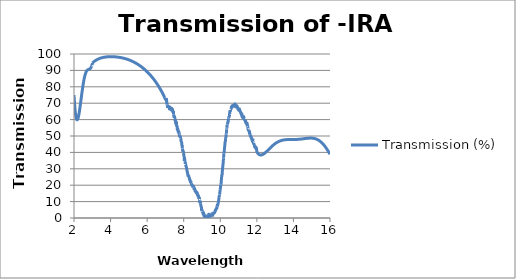
| Category | Transmission (%) |
|---|---|
| 2.00007 | 74.943 |
| 2.00994 | 73.118 |
| 2.0201 | 71.375 |
| 2.02997 | 69.81 |
| 2.03984 | 68.37 |
| 2.04998 | 67.018 |
| 2.05984 | 65.826 |
| 2.06999 | 64.724 |
| 2.07984 | 63.77 |
| 2.08997 | 62.906 |
| 2.09982 | 62.178 |
| 2.10995 | 61.54 |
| 2.11979 | 61.025 |
| 2.12991 | 60.598 |
| 2.14003 | 60.273 |
| 2.14986 | 60.051 |
| 2.15997 | 59.914 |
| 2.1698 | 59.867 |
| 2.1799 | 59.903 |
| 2.19 | 60.019 |
| 2.19982 | 60.206 |
| 2.20991 | 60.469 |
| 2.21972 | 60.79 |
| 2.22981 | 61.183 |
| 2.23989 | 61.635 |
| 2.24969 | 62.127 |
| 2.25977 | 62.684 |
| 2.26984 | 63.287 |
| 2.27991 | 63.932 |
| 2.2897 | 64.596 |
| 2.29976 | 65.313 |
| 2.30982 | 66.06 |
| 2.31987 | 66.833 |
| 2.32964 | 67.606 |
| 2.33969 | 68.42 |
| 2.34973 | 69.249 |
| 2.35977 | 70.089 |
| 2.36981 | 70.938 |
| 2.37984 | 71.791 |
| 2.38959 | 72.623 |
| 2.39962 | 73.477 |
| 2.40964 | 74.328 |
| 2.41965 | 75.171 |
| 2.42967 | 76.005 |
| 2.43968 | 76.827 |
| 2.44968 | 77.636 |
| 2.45968 | 78.428 |
| 2.46968 | 79.201 |
| 2.47968 | 79.955 |
| 2.48967 | 80.687 |
| 2.49965 | 81.396 |
| 2.50964 | 82.081 |
| 2.51961 | 82.739 |
| 2.52959 | 83.371 |
| 2.53956 | 83.976 |
| 2.54953 | 84.552 |
| 2.55949 | 85.099 |
| 2.56972 | 85.631 |
| 2.57968 | 86.119 |
| 2.58963 | 86.577 |
| 2.59957 | 87.005 |
| 2.60952 | 87.404 |
| 2.61945 | 87.775 |
| 2.62966 | 88.126 |
| 2.63959 | 88.439 |
| 2.64952 | 88.725 |
| 2.65944 | 88.985 |
| 2.66963 | 89.226 |
| 2.67954 | 89.436 |
| 2.68945 | 89.624 |
| 2.69963 | 89.794 |
| 2.70953 | 89.939 |
| 2.71943 | 90.066 |
| 2.72959 | 90.179 |
| 2.73948 | 90.274 |
| 2.74936 | 90.355 |
| 2.75951 | 90.426 |
| 2.76939 | 90.486 |
| 2.77953 | 90.539 |
| 2.78939 | 90.585 |
| 2.79953 | 90.628 |
| 2.80938 | 90.669 |
| 2.81951 | 90.711 |
| 2.82935 | 90.754 |
| 2.83947 | 90.802 |
| 2.84931 | 90.856 |
| 2.85941 | 90.92 |
| 2.86952 | 90.995 |
| 2.87934 | 91.079 |
| 2.88943 | 91.181 |
| 2.89925 | 91.295 |
| 2.90933 | 91.43 |
| 2.91941 | 91.585 |
| 2.92921 | 91.756 |
| 2.93927 | 91.954 |
| 2.94934 | 92.175 |
| 2.9594 | 92.421 |
| 2.96918 | 92.684 |
| 2.97923 | 92.98 |
| 2.98927 | 93.303 |
| 2.99931 | 93.228 |
| 3.00934 | 94.547 |
| 3.01937 | 94.653 |
| 3.02939 | 94.756 |
| 3.03914 | 94.853 |
| 3.04915 | 94.952 |
| 3.05916 | 95.048 |
| 3.06916 | 95.142 |
| 3.07916 | 95.234 |
| 3.08916 | 95.324 |
| 3.09914 | 95.412 |
| 3.10913 | 95.497 |
| 3.1191 | 95.581 |
| 3.12908 | 95.663 |
| 3.13931 | 95.745 |
| 3.14927 | 95.823 |
| 3.15923 | 95.899 |
| 3.16918 | 95.974 |
| 3.17913 | 96.046 |
| 3.18907 | 96.117 |
| 3.19927 | 96.188 |
| 3.2092 | 96.256 |
| 3.21912 | 96.322 |
| 3.22904 | 96.386 |
| 3.23922 | 96.451 |
| 3.24913 | 96.512 |
| 3.25904 | 96.572 |
| 3.2692 | 96.632 |
| 3.27909 | 96.689 |
| 3.28898 | 96.744 |
| 3.29913 | 96.8 |
| 3.309 | 96.852 |
| 3.31914 | 96.905 |
| 3.329 | 96.955 |
| 3.33912 | 97.005 |
| 3.34898 | 97.053 |
| 3.35909 | 97.1 |
| 3.36893 | 97.145 |
| 3.37903 | 97.19 |
| 3.38913 | 97.234 |
| 3.39895 | 97.276 |
| 3.40903 | 97.317 |
| 3.41911 | 97.358 |
| 3.42892 | 97.396 |
| 3.43898 | 97.434 |
| 3.44904 | 97.472 |
| 3.45883 | 97.507 |
| 3.46888 | 97.542 |
| 3.47892 | 97.576 |
| 3.48896 | 97.61 |
| 3.49899 | 97.642 |
| 3.50901 | 97.673 |
| 3.51903 | 97.703 |
| 3.52904 | 97.733 |
| 3.53878 | 97.761 |
| 3.54878 | 97.789 |
| 3.55877 | 97.815 |
| 3.56876 | 97.842 |
| 3.579 | 97.867 |
| 3.58897 | 97.892 |
| 3.59894 | 97.916 |
| 3.6089 | 97.938 |
| 3.61885 | 97.961 |
| 3.6288 | 97.982 |
| 3.63874 | 98.003 |
| 3.64894 | 98.023 |
| 3.65887 | 98.042 |
| 3.66879 | 98.061 |
| 3.6787 | 98.079 |
| 3.68887 | 98.096 |
| 3.69878 | 98.113 |
| 3.70867 | 98.129 |
| 3.71882 | 98.145 |
| 3.7287 | 98.159 |
| 3.73884 | 98.174 |
| 3.74871 | 98.187 |
| 3.75883 | 98.201 |
| 3.76869 | 98.213 |
| 3.7788 | 98.225 |
| 3.78864 | 98.236 |
| 3.79873 | 98.247 |
| 3.80882 | 98.257 |
| 3.81864 | 98.267 |
| 3.82872 | 98.276 |
| 3.83878 | 98.285 |
| 3.84859 | 98.293 |
| 3.85864 | 98.301 |
| 3.86868 | 98.308 |
| 3.87872 | 98.315 |
| 3.88875 | 98.321 |
| 3.89852 | 98.327 |
| 3.90854 | 98.332 |
| 3.91854 | 98.337 |
| 3.92855 | 98.341 |
| 3.93854 | 98.345 |
| 3.94853 | 98.348 |
| 3.95851 | 98.351 |
| 3.96848 | 98.354 |
| 3.9787 | 98.356 |
| 3.98866 | 98.358 |
| 3.99861 | 98.359 |
| 4.00856 | 98.36 |
| 4.01849 | 98.36 |
| 4.02867 | 98.36 |
| 4.0386 | 98.36 |
| 4.04851 | 98.359 |
| 4.05841 | 98.358 |
| 4.06857 | 98.356 |
| 4.07846 | 98.354 |
| 4.08859 | 98.351 |
| 4.09847 | 98.349 |
| 4.10859 | 98.345 |
| 4.11845 | 98.342 |
| 4.12855 | 98.338 |
| 4.1384 | 98.333 |
| 4.14849 | 98.328 |
| 4.15857 | 98.323 |
| 4.16839 | 98.318 |
| 4.17845 | 98.312 |
| 4.18851 | 98.305 |
| 4.19831 | 98.299 |
| 4.20835 | 98.291 |
| 4.21838 | 98.284 |
| 4.2284 | 98.276 |
| 4.23842 | 98.268 |
| 4.24842 | 98.259 |
| 4.25842 | 98.25 |
| 4.26841 | 98.241 |
| 4.2784 | 98.231 |
| 4.28837 | 98.221 |
| 4.29834 | 98.21 |
| 4.30829 | 98.199 |
| 4.31824 | 98.188 |
| 4.32843 | 98.176 |
| 4.33836 | 98.164 |
| 4.34829 | 98.152 |
| 4.3582 | 98.139 |
| 4.36836 | 98.126 |
| 4.37825 | 98.112 |
| 4.38839 | 98.098 |
| 4.39827 | 98.084 |
| 4.40839 | 98.069 |
| 4.41825 | 98.054 |
| 4.42835 | 98.038 |
| 4.4382 | 98.022 |
| 4.44828 | 98.006 |
| 4.45835 | 97.989 |
| 4.46817 | 97.972 |
| 4.47823 | 97.955 |
| 4.48828 | 97.937 |
| 4.49831 | 97.918 |
| 4.5081 | 97.9 |
| 4.51812 | 97.881 |
| 4.52813 | 97.861 |
| 4.53813 | 97.841 |
| 4.54812 | 97.821 |
| 4.5581 | 97.8 |
| 4.56807 | 97.779 |
| 4.57828 | 97.757 |
| 4.58823 | 97.735 |
| 4.59818 | 97.713 |
| 4.60811 | 97.69 |
| 4.61804 | 97.667 |
| 4.62819 | 97.643 |
| 4.6381 | 97.619 |
| 4.648 | 97.595 |
| 4.65812 | 97.57 |
| 4.668 | 97.544 |
| 4.67811 | 97.518 |
| 4.68797 | 97.492 |
| 4.69806 | 97.465 |
| 4.70813 | 97.438 |
| 4.71796 | 97.411 |
| 4.72802 | 97.382 |
| 4.73807 | 97.354 |
| 4.74811 | 97.325 |
| 4.75813 | 97.295 |
| 4.76791 | 97.266 |
| 4.77792 | 97.235 |
| 4.78792 | 97.205 |
| 4.79791 | 97.173 |
| 4.80788 | 97.142 |
| 4.81809 | 97.109 |
| 4.82804 | 97.076 |
| 4.83799 | 97.043 |
| 4.84792 | 97.009 |
| 4.85785 | 96.975 |
| 4.868 | 96.94 |
| 4.8779 | 96.905 |
| 4.88803 | 96.869 |
| 4.89791 | 96.833 |
| 4.90802 | 96.796 |
| 4.91788 | 96.76 |
| 4.92796 | 96.722 |
| 4.9378 | 96.684 |
| 4.94786 | 96.645 |
| 4.95792 | 96.606 |
| 4.96796 | 96.566 |
| 4.97799 | 96.525 |
| 4.98777 | 96.485 |
| 4.99778 | 96.444 |
| 5.00778 | 96.402 |
| 5.0176 | 96.361 |
| 5.02817 | 96.315 |
| 5.03799 | 96.273 |
| 5.0478 | 96.229 |
| 5.05762 | 96.186 |
| 5.06819 | 96.138 |
| 5.078 | 96.093 |
| 5.08781 | 96.048 |
| 5.09762 | 96.002 |
| 5.10743 | 95.956 |
| 5.11799 | 95.905 |
| 5.1278 | 95.858 |
| 5.13761 | 95.81 |
| 5.14741 | 95.761 |
| 5.15797 | 95.708 |
| 5.16777 | 95.659 |
| 5.17758 | 95.608 |
| 5.18738 | 95.558 |
| 5.19793 | 95.502 |
| 5.20773 | 95.45 |
| 5.21753 | 95.398 |
| 5.22732 | 95.345 |
| 5.23787 | 95.287 |
| 5.24767 | 95.233 |
| 5.25746 | 95.178 |
| 5.26801 | 95.118 |
| 5.2778 | 95.062 |
| 5.28759 | 95.006 |
| 5.29737 | 94.949 |
| 5.30792 | 94.887 |
| 5.3177 | 94.828 |
| 5.32749 | 94.769 |
| 5.33727 | 94.71 |
| 5.34781 | 94.645 |
| 5.35759 | 94.584 |
| 5.36737 | 94.523 |
| 5.3779 | 94.456 |
| 5.38768 | 94.394 |
| 5.39746 | 94.331 |
| 5.40724 | 94.267 |
| 5.41776 | 94.198 |
| 5.42754 | 94.133 |
| 5.43731 | 94.067 |
| 5.44783 | 93.996 |
| 5.4576 | 93.929 |
| 5.46737 | 93.861 |
| 5.47714 | 93.793 |
| 5.48766 | 93.719 |
| 5.49743 | 93.65 |
| 5.50719 | 93.579 |
| 5.51771 | 93.503 |
| 5.52747 | 93.432 |
| 5.53723 | 93.36 |
| 5.54774 | 93.282 |
| 5.5575 | 93.208 |
| 5.56726 | 93.134 |
| 5.57777 | 93.054 |
| 5.58752 | 92.979 |
| 5.59728 | 92.903 |
| 5.60778 | 92.82 |
| 5.61753 | 92.743 |
| 5.62728 | 92.665 |
| 5.63703 | 92.586 |
| 5.64753 | 92.501 |
| 5.65728 | 92.421 |
| 5.66702 | 92.34 |
| 5.67752 | 92.253 |
| 5.68726 | 92.171 |
| 5.69701 | 92.088 |
| 5.7075 | 91.998 |
| 5.71724 | 91.914 |
| 5.72698 | 91.829 |
| 5.73746 | 91.737 |
| 5.7472 | 91.65 |
| 5.75768 | 91.557 |
| 5.76742 | 91.469 |
| 5.77715 | 91.381 |
| 5.78763 | 91.285 |
| 5.79736 | 91.195 |
| 5.80709 | 91.104 |
| 5.81757 | 91.006 |
| 5.82729 | 90.914 |
| 5.83702 | 90.821 |
| 5.84749 | 90.72 |
| 5.85721 | 90.626 |
| 5.86693 | 90.531 |
| 5.8774 | 90.427 |
| 5.88712 | 90.331 |
| 5.89759 | 90.226 |
| 5.9073 | 90.128 |
| 5.91702 | 90.029 |
| 5.92748 | 89.922 |
| 5.93719 | 89.821 |
| 5.94691 | 89.72 |
| 5.95736 | 89.61 |
| 5.96707 | 89.507 |
| 5.97753 | 89.395 |
| 5.98723 | 89.291 |
| 5.99694 | 89.186 |
| 6.00739 | 89.072 |
| 6.01709 | 88.965 |
| 6.02679 | 88.857 |
| 6.03724 | 88.74 |
| 6.04694 | 88.631 |
| 6.05738 | 88.512 |
| 6.06708 | 88.401 |
| 6.07678 | 88.289 |
| 6.08722 | 88.168 |
| 6.09691 | 88.054 |
| 6.10734 | 87.931 |
| 6.11703 | 87.815 |
| 6.12672 | 87.699 |
| 6.13716 | 87.573 |
| 6.14684 | 87.455 |
| 6.15727 | 87.327 |
| 6.16696 | 87.207 |
| 6.17738 | 87.077 |
| 6.18706 | 86.955 |
| 6.19674 | 86.832 |
| 6.20717 | 86.699 |
| 6.21684 | 86.574 |
| 6.22726 | 86.439 |
| 6.23694 | 86.313 |
| 6.24661 | 86.185 |
| 6.25703 | 86.047 |
| 6.2667 | 85.918 |
| 6.27711 | 85.777 |
| 6.28678 | 85.646 |
| 6.29719 | 85.503 |
| 6.30685 | 85.37 |
| 6.31726 | 85.225 |
| 6.32692 | 85.089 |
| 6.33658 | 84.953 |
| 6.34698 | 84.805 |
| 6.35664 | 84.666 |
| 6.36704 | 84.515 |
| 6.3767 | 84.375 |
| 6.38709 | 84.222 |
| 6.39675 | 84.079 |
| 6.40714 | 83.923 |
| 6.41679 | 83.778 |
| 6.42718 | 83.62 |
| 6.43683 | 83.472 |
| 6.44647 | 83.324 |
| 6.45686 | 83.162 |
| 6.4665 | 83.011 |
| 6.47689 | 82.847 |
| 6.48653 | 82.693 |
| 6.49691 | 82.526 |
| 6.50655 | 82.37 |
| 6.51692 | 82.201 |
| 6.52656 | 82.042 |
| 6.53693 | 81.87 |
| 6.54657 | 81.709 |
| 6.55694 | 81.533 |
| 6.56657 | 81.37 |
| 6.57693 | 81.192 |
| 6.58656 | 81.025 |
| 6.59693 | 80.844 |
| 6.60655 | 80.675 |
| 6.61691 | 80.491 |
| 6.62653 | 80.318 |
| 6.63689 | 80.131 |
| 6.64651 | 79.956 |
| 6.65687 | 79.766 |
| 6.66648 | 79.588 |
| 6.67684 | 79.395 |
| 6.68645 | 79.213 |
| 6.6968 | 79.017 |
| 6.70641 | 78.832 |
| 6.71675 | 78.632 |
| 6.72636 | 78.445 |
| 6.7367 | 78.241 |
| 6.74631 | 78.05 |
| 6.75665 | 77.843 |
| 6.76625 | 77.649 |
| 6.77659 | 77.438 |
| 6.78692 | 77.225 |
| 6.79652 | 77.026 |
| 6.80685 | 76.809 |
| 6.81645 | 76.606 |
| 6.82678 | 76.386 |
| 6.83637 | 76.179 |
| 6.84669 | 75.955 |
| 6.85628 | 75.744 |
| 6.86661 | 75.516 |
| 6.87619 | 75.302 |
| 6.88651 | 75.069 |
| 6.89683 | 74.834 |
| 6.90641 | 74.614 |
| 6.91672 | 74.374 |
| 6.9263 | 74.15 |
| 6.93661 | 73.906 |
| 6.94619 | 73.677 |
| 6.9565 | 73.429 |
| 6.96681 | 73.178 |
| 6.97638 | 72.943 |
| 6.98668 | 72.687 |
| 6.99625 | 72.447 |
| 7.00655 | 73.133 |
| 7.01611 | 72.183 |
| 7.02641 | 72.683 |
| 7.03671 | 72.125 |
| 7.04626 | 73.067 |
| 7.05656 | 70.951 |
| 7.06611 | 71.668 |
| 7.0764 | 69.244 |
| 7.08669 | 69.224 |
| 7.09624 | 69.353 |
| 7.10653 | 68.425 |
| 7.11608 | 68.668 |
| 7.12636 | 67.087 |
| 7.13664 | 68.145 |
| 7.14618 | 67.66 |
| 7.15646 | 67.96 |
| 7.166 | 67.731 |
| 7.17627 | 67.795 |
| 7.18654 | 68.629 |
| 7.19608 | 67.409 |
| 7.20635 | 67.001 |
| 7.21661 | 67.989 |
| 7.22615 | 67.167 |
| 7.23641 | 65.731 |
| 7.24594 | 67.192 |
| 7.2562 | 67.504 |
| 7.26646 | 67.96 |
| 7.27598 | 66.456 |
| 7.28623 | 66.73 |
| 7.29649 | 66.665 |
| 7.30601 | 67.634 |
| 7.31626 | 66.815 |
| 7.3265 | 67.078 |
| 7.33602 | 65.164 |
| 7.34626 | 66.202 |
| 7.3565 | 65.787 |
| 7.36601 | 66.348 |
| 7.37625 | 66.5 |
| 7.38649 | 65.956 |
| 7.396 | 65.083 |
| 7.40623 | 65.052 |
| 7.41646 | 64.246 |
| 7.42596 | 64.823 |
| 7.43619 | 65.344 |
| 7.44642 | 63.251 |
| 7.45591 | 62.35 |
| 7.46614 | 61.944 |
| 7.47636 | 61.849 |
| 7.48585 | 61.066 |
| 7.49607 | 62.318 |
| 7.50628 | 61.035 |
| 7.51577 | 60.862 |
| 7.52598 | 59.588 |
| 7.53619 | 59.818 |
| 7.54568 | 58.907 |
| 7.55588 | 59.477 |
| 7.56609 | 57.538 |
| 7.57629 | 58.872 |
| 7.58577 | 58.381 |
| 7.59597 | 56.65 |
| 7.60617 | 58.347 |
| 7.61564 | 55.779 |
| 7.62583 | 56.23 |
| 7.63603 | 56.177 |
| 7.64622 | 54.611 |
| 7.65568 | 53.428 |
| 7.66587 | 54.797 |
| 7.67606 | 53.983 |
| 7.68624 | 53.559 |
| 7.6957 | 52.869 |
| 7.70588 | 52.337 |
| 7.71606 | 53.079 |
| 7.72623 | 52.366 |
| 7.73568 | 52.538 |
| 7.74586 | 52.031 |
| 7.75603 | 51.351 |
| 7.7662 | 50.419 |
| 7.77564 | 49.853 |
| 7.78581 | 50.104 |
| 7.79597 | 50.403 |
| 7.80614 | 49.197 |
| 7.81557 | 49.685 |
| 7.82573 | 48.627 |
| 7.83589 | 48.393 |
| 7.84604 | 48.081 |
| 7.85547 | 46.783 |
| 7.86562 | 46.605 |
| 7.87577 | 46.369 |
| 7.88592 | 46.17 |
| 7.89607 | 45.099 |
| 7.90549 | 43.981 |
| 7.91563 | 44.299 |
| 7.92577 | 42.49 |
| 7.93591 | 42.279 |
| 7.94605 | 40.816 |
| 7.95546 | 41.289 |
| 7.96559 | 40.223 |
| 7.97572 | 40.21 |
| 7.98585 | 39.294 |
| 7.99598 | 39.356 |
| 8.00538 | 38.442 |
| 8.01551 | 38.049 |
| 8.02563 | 36.747 |
| 8.03575 | 34.835 |
| 8.04587 | 36.961 |
| 8.05598 | 34.838 |
| 8.06538 | 34.638 |
| 8.07549 | 34.308 |
| 8.0856 | 32.964 |
| 8.09571 | 32.945 |
| 8.10582 | 32.919 |
| 8.11592 | 31.64 |
| 8.1253 | 31.93 |
| 8.1354 | 31.345 |
| 8.1455 | 31.075 |
| 8.1556 | 30.313 |
| 8.16569 | 29.93 |
| 8.17579 | 28.942 |
| 8.18588 | 28.881 |
| 8.19525 | 27.894 |
| 8.20534 | 27.705 |
| 8.21542 | 27.178 |
| 8.22551 | 26.405 |
| 8.23559 | 26.293 |
| 8.24567 | 25.225 |
| 8.25574 | 26.122 |
| 8.26582 | 25.785 |
| 8.27517 | 25.582 |
| 8.28525 | 25.005 |
| 8.29532 | 24.866 |
| 8.30538 | 24.379 |
| 8.31545 | 23.774 |
| 8.32552 | 23.768 |
| 8.33558 | 23.05 |
| 8.34564 | 23.172 |
| 8.3557 | 23.002 |
| 8.36575 | 21.89 |
| 8.37509 | 21.524 |
| 8.38514 | 22.52 |
| 8.39519 | 21.771 |
| 8.40524 | 21.31 |
| 8.41528 | 21.35 |
| 8.42533 | 21.226 |
| 8.43537 | 19.682 |
| 8.44541 | 19.843 |
| 8.45545 | 19.989 |
| 8.46549 | 19.444 |
| 8.47552 | 19.096 |
| 8.48555 | 20.174 |
| 8.49558 | 19.242 |
| 8.50561 | 19.437 |
| 8.51564 | 18.428 |
| 8.52566 | 18.831 |
| 8.53568 | 19.264 |
| 8.54499 | 18.696 |
| 8.555 | 18.958 |
| 8.56502 | 18.488 |
| 8.57503 | 17.104 |
| 8.58505 | 18.265 |
| 8.59506 | 17.769 |
| 8.60506 | 17.677 |
| 8.61507 | 16.753 |
| 8.62507 | 16.32 |
| 8.63508 | 16.654 |
| 8.64507 | 16.599 |
| 8.65507 | 16.258 |
| 8.66507 | 15.972 |
| 8.67506 | 15.813 |
| 8.68505 | 15.276 |
| 8.69504 | 15.553 |
| 8.70503 | 15.77 |
| 8.71501 | 14.858 |
| 8.725 | 15.34 |
| 8.73498 | 15.424 |
| 8.74496 | 14.909 |
| 8.75493 | 13.926 |
| 8.76491 | 13.816 |
| 8.77488 | 13.755 |
| 8.78485 | 14.009 |
| 8.79482 | 13.32 |
| 8.80479 | 13.479 |
| 8.81546 | 12.756 |
| 8.82542 | 12.331 |
| 8.83538 | 11.617 |
| 8.84534 | 12.212 |
| 8.8553 | 12.329 |
| 8.86525 | 11.236 |
| 8.8752 | 10.585 |
| 8.88515 | 10.733 |
| 8.8951 | 8.994 |
| 8.90504 | 10.228 |
| 8.91498 | 8.829 |
| 8.92493 | 8.181 |
| 8.93486 | 8 |
| 8.9448 | 7.217 |
| 8.95473 | 6.849 |
| 8.96538 | 6.544 |
| 8.97531 | 5.522 |
| 8.98523 | 4.272 |
| 8.99516 | 4.439 |
| 9.00508 | 4.765 |
| 9.015 | 3.856 |
| 9.02492 | 4.008 |
| 9.03484 | 3.703 |
| 9.04476 | 3.39 |
| 9.05467 | 2.625 |
| 9.06529 | 2.396 |
| 9.07519 | 2.981 |
| 9.0851 | 3.246 |
| 9.095 | 2.406 |
| 9.10491 | 1.447 |
| 9.11481 | 1.47 |
| 9.1247 | 2.101 |
| 9.1346 | 1.499 |
| 9.1452 | 0.833 |
| 9.15509 | 1.229 |
| 9.16498 | 1.333 |
| 9.17486 | 1.813 |
| 9.18475 | 0.813 |
| 9.19463 | 1.609 |
| 9.20451 | 0.967 |
| 9.21509 | 0.507 |
| 9.22497 | 0.55 |
| 9.23484 | 1.472 |
| 9.24471 | 1 |
| 9.25458 | 0.684 |
| 9.26515 | 1.151 |
| 9.27501 | 0.93 |
| 9.28487 | 1.216 |
| 9.29473 | 0.835 |
| 9.30459 | 1.17 |
| 9.31445 | 0.883 |
| 9.325 | 0.695 |
| 9.33485 | 0.831 |
| 9.3447 | 1.059 |
| 9.35455 | 1.573 |
| 9.36439 | 2.28 |
| 9.37494 | 1.906 |
| 9.38477 | 1.754 |
| 9.39461 | 1.125 |
| 9.40445 | 0.869 |
| 9.41498 | 1.158 |
| 9.42481 | 1.52 |
| 9.43464 | 1.591 |
| 9.44446 | 1.021 |
| 9.45499 | 1.378 |
| 9.46481 | 1.908 |
| 9.47463 | 0.892 |
| 9.48444 | 1.334 |
| 9.49496 | 2.346 |
| 9.50477 | 2.085 |
| 9.51458 | 1.971 |
| 9.52439 | 2.351 |
| 9.53489 | 1.077 |
| 9.54469 | 1.36 |
| 9.55449 | 1.813 |
| 9.56429 | 2.433 |
| 9.57479 | 1.59 |
| 9.58458 | 1.623 |
| 9.59437 | 2.699 |
| 9.60486 | 2.081 |
| 9.61464 | 3.717 |
| 9.62443 | 2.53 |
| 9.63421 | 3.089 |
| 9.64469 | 2.488 |
| 9.65446 | 3.651 |
| 9.66424 | 3.694 |
| 9.67471 | 3.169 |
| 9.68448 | 3.548 |
| 9.69424 | 3.632 |
| 9.70471 | 3.941 |
| 9.71447 | 4.136 |
| 9.72423 | 4.069 |
| 9.73468 | 4.907 |
| 9.74444 | 4.769 |
| 9.75419 | 5.156 |
| 9.76464 | 5.204 |
| 9.77439 | 5.721 |
| 9.78413 | 5.679 |
| 9.79457 | 5.675 |
| 9.80431 | 6.043 |
| 9.81475 | 6.138 |
| 9.82448 | 7.108 |
| 9.83422 | 7.653 |
| 9.84464 | 7.013 |
| 9.85437 | 8.466 |
| 9.8641 | 7.92 |
| 9.87452 | 9.2 |
| 9.88424 | 9.533 |
| 9.89465 | 9.641 |
| 9.90437 | 10.31 |
| 9.91408 | 11.248 |
| 9.92449 | 11.848 |
| 9.9342 | 12.546 |
| 9.9446 | 12.812 |
| 9.9543 | 14.356 |
| 9.96401 | 14.52 |
| 9.9744 | 15.23 |
| 9.9841 | 17.101 |
| 9.99448 | 17.134 |
| 10.00417 | 18.116 |
| 10.01456 | 19.681 |
| 10.02424 | 19.319 |
| 10.03393 | 20.47 |
| 10.0443 | 21.026 |
| 10.05398 | 22.502 |
| 10.06435 | 23.898 |
| 10.07403 | 25.084 |
| 10.08439 | 26.434 |
| 10.09406 | 26.246 |
| 10.10442 | 26.99 |
| 10.11408 | 28.841 |
| 10.12444 | 30.477 |
| 10.1341 | 31.111 |
| 10.14444 | 32.288 |
| 10.1541 | 33.243 |
| 10.16444 | 34.386 |
| 10.17409 | 36.414 |
| 10.18443 | 37.05 |
| 10.19407 | 39.504 |
| 10.2044 | 39.671 |
| 10.21404 | 40.188 |
| 10.22437 | 41.826 |
| 10.234 | 42.648 |
| 10.24432 | 44.357 |
| 10.25395 | 44.908 |
| 10.26427 | 46.35 |
| 10.27389 | 46.258 |
| 10.2842 | 47.551 |
| 10.29382 | 48.539 |
| 10.30413 | 48.827 |
| 10.31374 | 50.683 |
| 10.32404 | 51.087 |
| 10.33434 | 51.637 |
| 10.34394 | 53.947 |
| 10.35423 | 54.566 |
| 10.36383 | 54.975 |
| 10.37412 | 56.956 |
| 10.38372 | 57.039 |
| 10.39399 | 57.421 |
| 10.40427 | 57.71 |
| 10.41386 | 58.727 |
| 10.42413 | 58.471 |
| 10.43371 | 58.389 |
| 10.44398 | 60.574 |
| 10.45424 | 61.36 |
| 10.46382 | 61.592 |
| 10.47407 | 61.502 |
| 10.48365 | 61.578 |
| 10.4939 | 61.847 |
| 10.50415 | 63.229 |
| 10.51371 | 63.383 |
| 10.52395 | 65.039 |
| 10.53419 | 65.253 |
| 10.54375 | 64.893 |
| 10.55398 | 65.824 |
| 10.56421 | 65.819 |
| 10.57376 | 66.14 |
| 10.58398 | 66.44 |
| 10.59353 | 66.566 |
| 10.60375 | 67.161 |
| 10.61396 | 68.025 |
| 10.62418 | 67.08 |
| 10.63371 | 67.428 |
| 10.64392 | 68.033 |
| 10.65412 | 68.787 |
| 10.66365 | 67.729 |
| 10.67385 | 68.946 |
| 10.68404 | 69.155 |
| 10.69356 | 67.828 |
| 10.70375 | 67.848 |
| 10.71394 | 68.422 |
| 10.72345 | 69.081 |
| 10.73363 | 68.419 |
| 10.74381 | 68.984 |
| 10.75399 | 68.877 |
| 10.76348 | 68.229 |
| 10.77366 | 68.735 |
| 10.78382 | 68.648 |
| 10.79399 | 68.586 |
| 10.80347 | 69.52 |
| 10.81363 | 69.236 |
| 10.82379 | 68.88 |
| 10.83395 | 67.872 |
| 10.84342 | 67.786 |
| 10.85357 | 68.182 |
| 10.86371 | 68.22 |
| 10.87386 | 68.233 |
| 10.88332 | 67.195 |
| 10.89346 | 67.878 |
| 10.90359 | 68.232 |
| 10.91372 | 68.325 |
| 10.92385 | 67.419 |
| 10.9333 | 68.02 |
| 10.94342 | 67.436 |
| 10.95354 | 66.778 |
| 10.96365 | 66.398 |
| 10.97377 | 66.697 |
| 10.98388 | 66.531 |
| 10.99331 | 65.883 |
| 11.00341 | 66.21 |
| 11.01351 | 65.979 |
| 11.02361 | 67.225 |
| 11.03371 | 65.606 |
| 11.0438 | 66.509 |
| 11.05321 | 66.093 |
| 11.0633 | 65.279 |
| 11.07338 | 65.564 |
| 11.08346 | 65.387 |
| 11.09354 | 64.762 |
| 11.10361 | 64.523 |
| 11.11368 | 64.341 |
| 11.12375 | 63.782 |
| 11.13315 | 63.931 |
| 11.14321 | 64.031 |
| 11.15327 | 63.192 |
| 11.16332 | 63.063 |
| 11.17338 | 63.813 |
| 11.18342 | 62.977 |
| 11.19347 | 61.692 |
| 11.20351 | 61.631 |
| 11.21356 | 61.587 |
| 11.22359 | 62.489 |
| 11.23363 | 61.449 |
| 11.24366 | 61.808 |
| 11.25369 | 61.1 |
| 11.26371 | 60.85 |
| 11.27306 | 60.833 |
| 11.28308 | 61.657 |
| 11.2931 | 61.389 |
| 11.30311 | 60.333 |
| 11.31312 | 60.478 |
| 11.32313 | 60.088 |
| 11.33313 | 60.204 |
| 11.34313 | 59.969 |
| 11.35313 | 60.166 |
| 11.36312 | 58.845 |
| 11.37312 | 59.543 |
| 11.3831 | 58.99 |
| 11.39309 | 58.085 |
| 11.40307 | 58.786 |
| 11.41305 | 57.421 |
| 11.42302 | 57.41 |
| 11.433 | 58.077 |
| 11.44297 | 57.083 |
| 11.45293 | 58.396 |
| 11.46356 | 56.392 |
| 11.47352 | 56.155 |
| 11.48347 | 56.731 |
| 11.49343 | 56.095 |
| 11.50338 | 56.045 |
| 11.51333 | 54.79 |
| 11.52327 | 53.787 |
| 11.53321 | 54.047 |
| 11.54315 | 53.789 |
| 11.55308 | 53.947 |
| 11.56301 | 52.76 |
| 11.57294 | 52.583 |
| 11.58287 | 52.606 |
| 11.59345 | 53.316 |
| 11.60337 | 50.979 |
| 11.61328 | 51.375 |
| 11.62319 | 51.415 |
| 11.6331 | 50.459 |
| 11.64301 | 50.108 |
| 11.65291 | 50.194 |
| 11.66281 | 49.691 |
| 11.67336 | 49.721 |
| 11.68326 | 49.066 |
| 11.69315 | 49.426 |
| 11.70303 | 48.962 |
| 11.71292 | 48.463 |
| 11.7228 | 47.918 |
| 11.73333 | 48.207 |
| 11.7432 | 47.649 |
| 11.75307 | 46.839 |
| 11.76294 | 46.841 |
| 11.7728 | 48.32 |
| 11.78332 | 46.864 |
| 11.79318 | 46.819 |
| 11.80303 | 45.909 |
| 11.81288 | 45.62 |
| 11.82273 | 45.774 |
| 11.83323 | 45.853 |
| 11.84307 | 44.492 |
| 11.8529 | 44.572 |
| 11.86274 | 44.469 |
| 11.87322 | 44.571 |
| 11.88305 | 43.202 |
| 11.89288 | 43.45 |
| 11.9027 | 42.641 |
| 11.91317 | 43.442 |
| 11.92298 | 43.119 |
| 11.93279 | 43.355 |
| 11.9426 | 42.58 |
| 11.95306 | 42.27 |
| 11.96286 | 42.93 |
| 11.97265 | 42.73 |
| 11.9831 | 41.944 |
| 11.99289 | 41.088 |
| 12.00268 | 40.271 |
| 12.01311 | 40.078 |
| 12.02289 | 39.908 |
| 12.03267 | 39.75 |
| 12.0431 | 39.593 |
| 12.05287 | 39.456 |
| 12.06263 | 39.329 |
| 12.07305 | 39.205 |
| 12.08281 | 39.098 |
| 12.09257 | 39 |
| 12.10297 | 38.905 |
| 12.11272 | 38.826 |
| 12.12247 | 38.754 |
| 12.13286 | 38.687 |
| 12.1426 | 38.632 |
| 12.15298 | 38.581 |
| 12.16272 | 38.542 |
| 12.17245 | 38.509 |
| 12.18282 | 38.482 |
| 12.19254 | 38.463 |
| 12.20291 | 38.45 |
| 12.21263 | 38.445 |
| 12.22299 | 38.445 |
| 12.23269 | 38.451 |
| 12.2424 | 38.463 |
| 12.25275 | 38.482 |
| 12.26245 | 38.504 |
| 12.27279 | 38.534 |
| 12.28248 | 38.566 |
| 12.29281 | 38.606 |
| 12.3025 | 38.648 |
| 12.31282 | 38.697 |
| 12.3225 | 38.747 |
| 12.33282 | 38.805 |
| 12.34249 | 38.862 |
| 12.3528 | 38.928 |
| 12.36247 | 38.993 |
| 12.37277 | 39.065 |
| 12.38243 | 39.136 |
| 12.39272 | 39.215 |
| 12.40237 | 39.292 |
| 12.41266 | 39.377 |
| 12.42231 | 39.459 |
| 12.43259 | 39.549 |
| 12.44222 | 39.636 |
| 12.4525 | 39.73 |
| 12.46277 | 39.827 |
| 12.47239 | 39.919 |
| 12.48265 | 40.02 |
| 12.49227 | 40.115 |
| 12.50253 | 40.219 |
| 12.51278 | 40.324 |
| 12.52239 | 40.424 |
| 12.53263 | 40.532 |
| 12.54223 | 40.634 |
| 12.55247 | 40.743 |
| 12.5627 | 40.854 |
| 12.57229 | 40.958 |
| 12.58251 | 41.07 |
| 12.59273 | 41.183 |
| 12.60231 | 41.289 |
| 12.61252 | 41.402 |
| 12.62209 | 41.509 |
| 12.6323 | 41.623 |
| 12.6425 | 41.737 |
| 12.6527 | 41.851 |
| 12.66226 | 41.958 |
| 12.67245 | 42.072 |
| 12.68263 | 42.185 |
| 12.69218 | 42.292 |
| 12.70236 | 42.405 |
| 12.71253 | 42.517 |
| 12.72206 | 42.623 |
| 12.73223 | 42.734 |
| 12.74239 | 42.845 |
| 12.75255 | 42.956 |
| 12.76207 | 43.059 |
| 12.77222 | 43.168 |
| 12.78237 | 43.276 |
| 12.79251 | 43.383 |
| 12.80202 | 43.483 |
| 12.81215 | 43.589 |
| 12.82229 | 43.693 |
| 12.83241 | 43.797 |
| 12.84254 | 43.899 |
| 12.85202 | 43.994 |
| 12.86214 | 44.094 |
| 12.87225 | 44.193 |
| 12.88236 | 44.291 |
| 12.89246 | 44.388 |
| 12.90193 | 44.477 |
| 12.91203 | 44.571 |
| 12.92212 | 44.664 |
| 12.9322 | 44.755 |
| 12.94229 | 44.845 |
| 12.95237 | 44.934 |
| 12.96244 | 45.021 |
| 12.97189 | 45.102 |
| 12.98195 | 45.187 |
| 12.99202 | 45.27 |
| 13.00208 | 45.351 |
| 13.01213 | 45.432 |
| 13.02218 | 45.51 |
| 13.03223 | 45.588 |
| 13.04227 | 45.663 |
| 13.05231 | 45.738 |
| 13.06235 | 45.81 |
| 13.07238 | 45.882 |
| 13.08178 | 45.947 |
| 13.0918 | 46.015 |
| 13.10182 | 46.082 |
| 13.11184 | 46.148 |
| 13.12185 | 46.212 |
| 13.13185 | 46.274 |
| 13.14186 | 46.335 |
| 13.15186 | 46.394 |
| 13.16185 | 46.452 |
| 13.17184 | 46.509 |
| 13.18183 | 46.564 |
| 13.19181 | 46.618 |
| 13.20179 | 46.67 |
| 13.21176 | 46.721 |
| 13.22173 | 46.77 |
| 13.2317 | 46.818 |
| 13.24166 | 46.864 |
| 13.25224 | 46.912 |
| 13.26219 | 46.956 |
| 13.27214 | 46.999 |
| 13.28209 | 47.04 |
| 13.29203 | 47.079 |
| 13.30196 | 47.118 |
| 13.3119 | 47.155 |
| 13.32182 | 47.191 |
| 13.33175 | 47.226 |
| 13.34167 | 47.259 |
| 13.35158 | 47.292 |
| 13.36211 | 47.325 |
| 13.37202 | 47.354 |
| 13.38192 | 47.383 |
| 13.39182 | 47.411 |
| 13.40172 | 47.437 |
| 13.41161 | 47.463 |
| 13.42211 | 47.489 |
| 13.43199 | 47.512 |
| 13.44187 | 47.534 |
| 13.45174 | 47.556 |
| 13.46161 | 47.576 |
| 13.4721 | 47.596 |
| 13.48196 | 47.615 |
| 13.49181 | 47.632 |
| 13.50166 | 47.649 |
| 13.51151 | 47.665 |
| 13.52197 | 47.681 |
| 13.53181 | 47.695 |
| 13.54165 | 47.708 |
| 13.55148 | 47.721 |
| 13.56192 | 47.733 |
| 13.57174 | 47.744 |
| 13.58156 | 47.755 |
| 13.59198 | 47.765 |
| 13.60179 | 47.774 |
| 13.6116 | 47.783 |
| 13.6214 | 47.791 |
| 13.63181 | 47.798 |
| 13.6416 | 47.805 |
| 13.65139 | 47.811 |
| 13.66178 | 47.818 |
| 13.67156 | 47.823 |
| 13.68195 | 47.828 |
| 13.69172 | 47.832 |
| 13.70148 | 47.836 |
| 13.71185 | 47.84 |
| 13.72161 | 47.843 |
| 13.73136 | 47.846 |
| 13.74172 | 47.849 |
| 13.75146 | 47.851 |
| 13.76181 | 47.853 |
| 13.77155 | 47.854 |
| 13.78189 | 47.856 |
| 13.79161 | 47.857 |
| 13.80133 | 47.858 |
| 13.81166 | 47.859 |
| 13.82137 | 47.86 |
| 13.83169 | 47.86 |
| 13.84139 | 47.861 |
| 13.8517 | 47.861 |
| 13.86139 | 47.862 |
| 13.87169 | 47.862 |
| 13.88137 | 47.862 |
| 13.89166 | 47.862 |
| 13.90134 | 47.862 |
| 13.91162 | 47.862 |
| 13.92128 | 47.863 |
| 13.93155 | 47.863 |
| 13.94121 | 47.863 |
| 13.95147 | 47.863 |
| 13.96172 | 47.864 |
| 13.97137 | 47.864 |
| 13.98161 | 47.865 |
| 13.99125 | 47.866 |
| 14.00148 | 47.867 |
| 14.01171 | 47.868 |
| 14.02134 | 47.869 |
| 14.03156 | 47.871 |
| 14.04117 | 47.872 |
| 14.05138 | 47.874 |
| 14.06158 | 47.876 |
| 14.07118 | 47.878 |
| 14.08138 | 47.881 |
| 14.09157 | 47.884 |
| 14.10116 | 47.887 |
| 14.11134 | 47.89 |
| 14.12151 | 47.894 |
| 14.13109 | 47.898 |
| 14.14125 | 47.902 |
| 14.15142 | 47.906 |
| 14.16157 | 47.911 |
| 14.17113 | 47.916 |
| 14.18127 | 47.921 |
| 14.19141 | 47.927 |
| 14.20155 | 47.933 |
| 14.21109 | 47.939 |
| 14.22121 | 47.946 |
| 14.23134 | 47.953 |
| 14.24145 | 47.96 |
| 14.25097 | 47.967 |
| 14.26108 | 47.975 |
| 14.27118 | 47.983 |
| 14.28128 | 47.992 |
| 14.29137 | 48.001 |
| 14.30146 | 48.01 |
| 14.31095 | 48.019 |
| 14.32102 | 48.029 |
| 14.3311 | 48.039 |
| 14.34116 | 48.05 |
| 14.35123 | 48.06 |
| 14.36128 | 48.071 |
| 14.37134 | 48.083 |
| 14.38138 | 48.094 |
| 14.39142 | 48.106 |
| 14.40087 | 48.117 |
| 14.4109 | 48.13 |
| 14.42093 | 48.142 |
| 14.43095 | 48.155 |
| 14.44097 | 48.168 |
| 14.45098 | 48.181 |
| 14.46099 | 48.194 |
| 14.47099 | 48.208 |
| 14.48099 | 48.222 |
| 14.49098 | 48.236 |
| 14.50096 | 48.25 |
| 14.51095 | 48.264 |
| 14.52092 | 48.278 |
| 14.53089 | 48.292 |
| 14.54086 | 48.307 |
| 14.55082 | 48.321 |
| 14.56077 | 48.336 |
| 14.57131 | 48.351 |
| 14.58126 | 48.366 |
| 14.5912 | 48.38 |
| 14.60113 | 48.395 |
| 14.61106 | 48.409 |
| 14.62098 | 48.424 |
| 14.6309 | 48.438 |
| 14.64082 | 48.453 |
| 14.65073 | 48.467 |
| 14.66121 | 48.482 |
| 14.67111 | 48.495 |
| 14.68101 | 48.509 |
| 14.69089 | 48.522 |
| 14.70078 | 48.536 |
| 14.71065 | 48.549 |
| 14.72111 | 48.562 |
| 14.73098 | 48.574 |
| 14.74084 | 48.586 |
| 14.75069 | 48.598 |
| 14.76112 | 48.61 |
| 14.77097 | 48.621 |
| 14.78081 | 48.631 |
| 14.79065 | 48.641 |
| 14.80106 | 48.652 |
| 14.81088 | 48.661 |
| 14.8207 | 48.669 |
| 14.83109 | 48.677 |
| 14.8409 | 48.685 |
| 14.8507 | 48.692 |
| 14.86108 | 48.698 |
| 14.87087 | 48.704 |
| 14.88066 | 48.708 |
| 14.89102 | 48.713 |
| 14.90079 | 48.716 |
| 14.91057 | 48.718 |
| 14.92091 | 48.72 |
| 14.93067 | 48.721 |
| 14.941 | 48.721 |
| 14.95075 | 48.72 |
| 14.96049 | 48.718 |
| 14.9708 | 48.715 |
| 14.98054 | 48.712 |
| 14.99084 | 48.707 |
| 15.00056 | 48.701 |
| 15.01085 | 48.694 |
| 15.02056 | 48.686 |
| 15.03084 | 48.676 |
| 15.04054 | 48.666 |
| 15.05081 | 48.654 |
| 15.0605 | 48.641 |
| 15.07075 | 48.627 |
| 15.08043 | 48.612 |
| 15.09068 | 48.594 |
| 15.10091 | 48.576 |
| 15.11058 | 48.557 |
| 15.1208 | 48.535 |
| 15.13045 | 48.513 |
| 15.14067 | 48.488 |
| 15.15088 | 48.462 |
| 15.16051 | 48.436 |
| 15.17071 | 48.407 |
| 15.18033 | 48.378 |
| 15.19052 | 48.345 |
| 15.20069 | 48.311 |
| 15.2103 | 48.277 |
| 15.22047 | 48.239 |
| 15.23063 | 48.2 |
| 15.24079 | 48.158 |
| 15.25037 | 48.118 |
| 15.26051 | 48.073 |
| 15.27065 | 48.026 |
| 15.28078 | 47.977 |
| 15.29035 | 47.93 |
| 15.30046 | 47.877 |
| 15.31058 | 47.823 |
| 15.32069 | 47.766 |
| 15.33023 | 47.711 |
| 15.34032 | 47.651 |
| 15.35041 | 47.588 |
| 15.36049 | 47.524 |
| 15.37057 | 47.457 |
| 15.38064 | 47.388 |
| 15.39071 | 47.318 |
| 15.40021 | 47.249 |
| 15.41026 | 47.174 |
| 15.42031 | 47.097 |
| 15.43035 | 47.017 |
| 15.44039 | 46.936 |
| 15.45042 | 46.852 |
| 15.46044 | 46.766 |
| 15.47046 | 46.678 |
| 15.48047 | 46.588 |
| 15.49047 | 46.495 |
| 15.50047 | 46.4 |
| 15.51046 | 46.303 |
| 15.52045 | 46.204 |
| 15.53043 | 46.102 |
| 15.5404 | 45.998 |
| 15.55037 | 45.892 |
| 15.56033 | 45.784 |
| 15.57029 | 45.673 |
| 15.58024 | 45.561 |
| 15.59018 | 45.445 |
| 15.60012 | 45.328 |
| 15.61005 | 45.209 |
| 15.62052 | 45.08 |
| 15.63044 | 44.956 |
| 15.64036 | 44.83 |
| 15.65026 | 44.701 |
| 15.66016 | 44.57 |
| 15.67005 | 44.437 |
| 15.68049 | 44.295 |
| 15.69037 | 44.158 |
| 15.70025 | 44.018 |
| 15.71012 | 43.877 |
| 15.71998 | 43.733 |
| 15.73038 | 43.579 |
| 15.74023 | 43.432 |
| 15.75007 | 43.282 |
| 15.75991 | 43.13 |
| 15.77029 | 42.968 |
| 15.78011 | 42.812 |
| 15.78993 | 42.655 |
| 15.80029 | 42.486 |
| 15.81009 | 42.325 |
| 15.81989 | 42.162 |
| 15.83023 | 41.988 |
| 15.84002 | 41.822 |
| 15.85034 | 41.644 |
| 15.86011 | 41.474 |
| 15.86988 | 41.302 |
| 15.88018 | 41.12 |
| 15.88994 | 40.945 |
| 15.90023 | 40.76 |
| 15.90997 | 40.582 |
| 15.92024 | 40.394 |
| 15.92997 | 40.214 |
| 15.94023 | 40.022 |
| 15.94995 | 39.84 |
| 15.9602 | 39.646 |
| 15.9699 | 39.462 |
| 15.98013 | 39.266 |
| 15.98982 | 39.08 |
| 16.00004 | 38.883 |